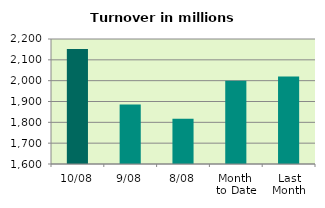
| Category | Series 0 |
|---|---|
| 10/08 | 2151.876 |
| 9/08 | 1885.562 |
| 8/08 | 1817.357 |
| Month 
to Date | 1999.984 |
| Last
Month | 2019.592 |